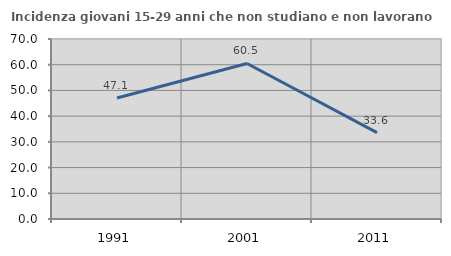
| Category | Incidenza giovani 15-29 anni che non studiano e non lavorano  |
|---|---|
| 1991.0 | 47.084 |
| 2001.0 | 60.484 |
| 2011.0 | 33.587 |